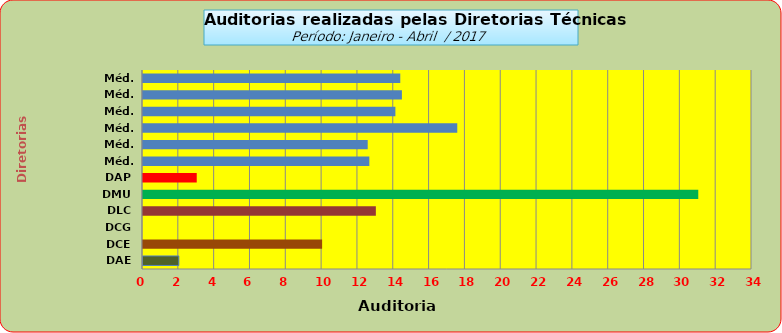
| Category | Series 0 |
|---|---|
| DAE | 2 |
| DCE | 10 |
| DCG | 0 |
| DLC | 13 |
| DMU | 31 |
| DAP | 3 |
| Méd. 2011 | 12.636 |
| Méd. 2012 | 12.545 |
| Méd. 2013 | 17.545 |
| Méd. 2014 | 14.091 |
| Méd. 2015 | 14.455 |
| Méd. 2016 | 14.364 |